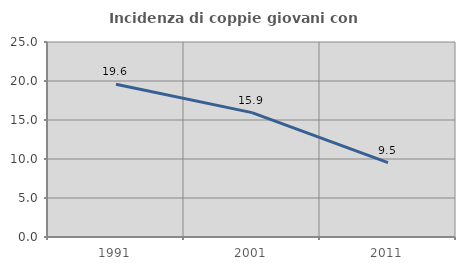
| Category | Incidenza di coppie giovani con figli |
|---|---|
| 1991.0 | 19.588 |
| 2001.0 | 15.947 |
| 2011.0 | 9.524 |